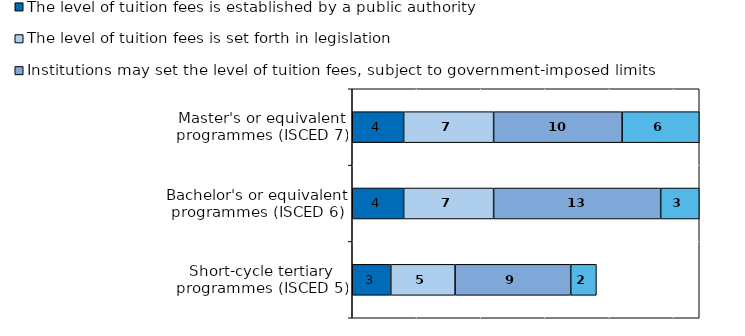
| Category | The level of tuition fees is established by a public authority | The level of tuition fees is set forth in legislation | Institutions may set the level of tuition fees, subject to government-imposed limits | Institutions may set the level of tuition fees independently, without government-imposed limits |
|---|---|---|---|---|
| Short-cycle tertiary programmes (ISCED 5) | 3 | 5 | 9 | 2 |
| Bachelor's or equivalent programmes (ISCED 6) | 4 | 7 | 13 | 3 |
| Master's or equivalent programmes (ISCED 7) | 4 | 7 | 10 | 6 |